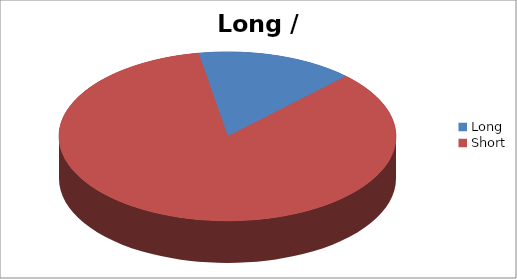
| Category | Series 1 |
|---|---|
| Long | 15 |
| Short | 84 |